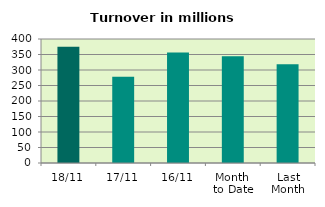
| Category | Series 0 |
|---|---|
| 18/11 | 374.666 |
| 17/11 | 277.932 |
| 16/11 | 356.171 |
| Month 
to Date | 344.546 |
| Last
Month | 318.176 |